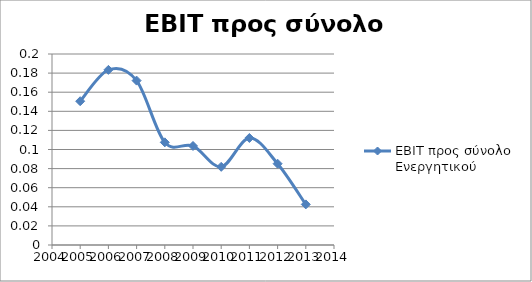
| Category | EBIT προς σύνολο Ενεργητικού |
|---|---|
| 2005.0 | 0.151 |
| 2006.0 | 0.183 |
| 2007.0 | 0.172 |
| 2008.0 | 0.107 |
| 2009.0 | 0.104 |
| 2010.0 | 0.082 |
| 2011.0 | 0.112 |
| 2012.0 | 0.085 |
| 2013.0 | 0.042 |